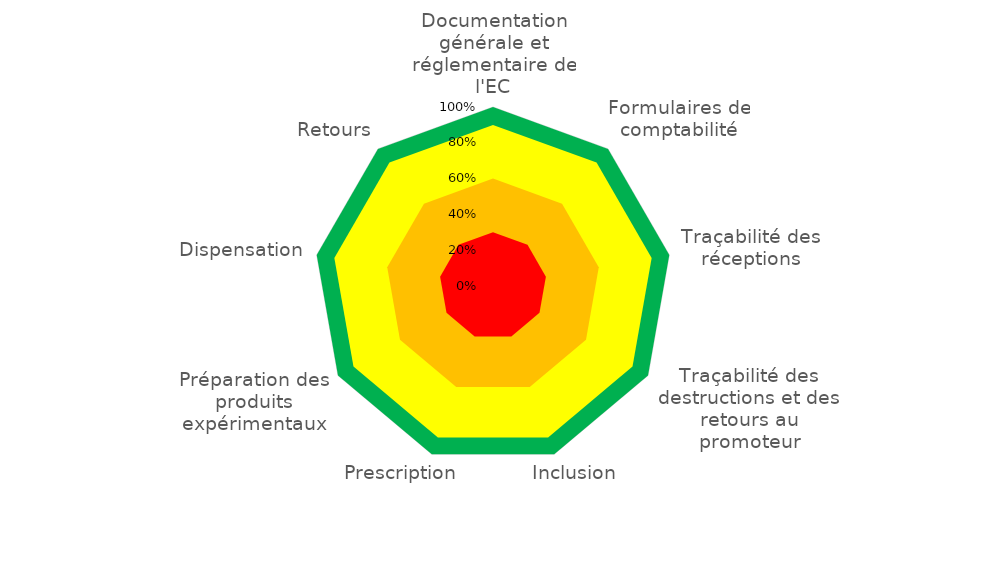
| Category | Series 0 | Series 1 | Series 2 | Series 3 | Série 5 |
|---|---|---|---|---|---|
| Documentation générale et réglementaire de l'EC | 1 | 0.9 | 0.6 | 0.3 | 0 |
| Formulaires de comptabilité | 1 | 0.9 | 0.6 | 0.3 | 0 |
| Traçabilité des réceptions | 1 | 0.9 | 0.6 | 0.3 | 0 |
| Traçabilité des destructions et des retours au promoteur | 1 | 0.9 | 0.6 | 0.3 | 0 |
| Inclusion | 1 | 0.9 | 0.6 | 0.3 | 0 |
| Prescription | 1 | 0.9 | 0.6 | 0.3 | 0 |
| Préparation des produits expérimentaux | 1 | 0.9 | 0.6 | 0.3 | 0 |
| Dispensation | 1 | 0.9 | 0.6 | 0.3 | 0 |
| Retours | 1 | 0.9 | 0.6 | 0.3 | 0 |